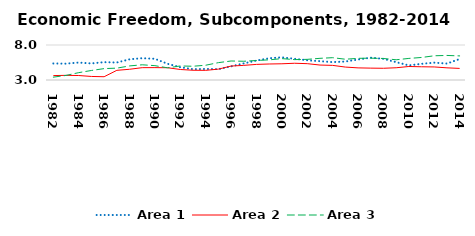
| Category | Area 1 | Area 2 | Area 3 |
|---|---|---|---|
| 1982.0 | 5.363 | 3.63 | 3.409 |
| 1983.0 | 5.333 | 3.663 | 3.656 |
| 1984.0 | 5.494 | 3.641 | 4.053 |
| 1985.0 | 5.362 | 3.506 | 4.36 |
| 1986.0 | 5.553 | 3.468 | 4.627 |
| 1987.0 | 5.498 | 4.38 | 4.694 |
| 1988.0 | 5.954 | 4.532 | 5.011 |
| 1989.0 | 6.116 | 4.763 | 5.172 |
| 1990.0 | 6.026 | 4.768 | 5.049 |
| 1991.0 | 5.313 | 4.751 | 4.739 |
| 1992.0 | 4.816 | 4.501 | 5.005 |
| 1993.0 | 4.548 | 4.391 | 4.964 |
| 1994.0 | 4.578 | 4.379 | 5.113 |
| 1995.0 | 4.55 | 4.554 | 5.481 |
| 1996.0 | 4.948 | 4.993 | 5.716 |
| 1997.0 | 5.378 | 5.091 | 5.677 |
| 1998.0 | 5.77 | 5.229 | 5.787 |
| 1999.0 | 6.11 | 5.286 | 5.879 |
| 2000.0 | 6.234 | 5.319 | 6.055 |
| 2001.0 | 6.026 | 5.391 | 5.912 |
| 2002.0 | 5.817 | 5.333 | 5.95 |
| 2003.0 | 5.687 | 5.135 | 6.097 |
| 2004.0 | 5.557 | 5.088 | 6.188 |
| 2005.0 | 5.639 | 4.848 | 5.966 |
| 2006.0 | 5.932 | 4.732 | 6.095 |
| 2007.0 | 6.187 | 4.696 | 6.122 |
| 2008.0 | 6.02 | 4.674 | 6.073 |
| 2009.0 | 5.55 | 4.75 | 5.89 |
| 2010.0 | 5.085 | 4.93 | 6.084 |
| 2011.0 | 5.313 | 4.889 | 6.218 |
| 2012.0 | 5.479 | 4.865 | 6.462 |
| 2013.0 | 5.348 | 4.737 | 6.509 |
| 2014.0 | 6 | 4.654 | 6.444 |